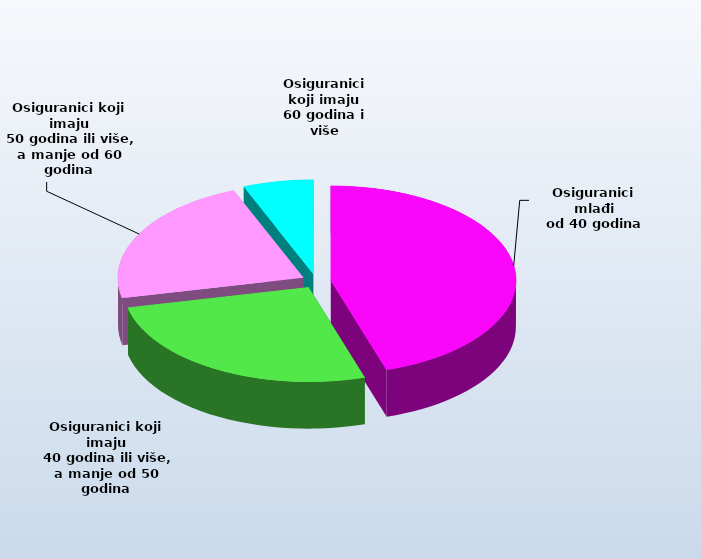
| Category | Series 0 |
|---|---|
| Osiguranici mlađi
od 40 godina | 715433 |
| Osiguranici koji imaju
 40 godina ili više, a manje od 50 godina | 418793 |
| Osiguranici koji imaju
 50 godina ili više, a manje od 60 godina | 354287 |
| Osiguranici koji imaju
60 godina i više | 97163 |